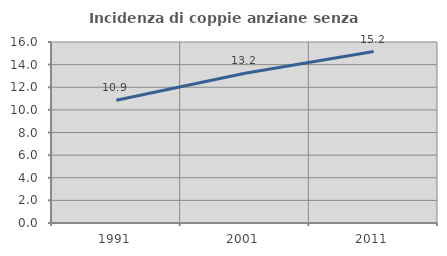
| Category | Incidenza di coppie anziane senza figli  |
|---|---|
| 1991.0 | 10.858 |
| 2001.0 | 13.236 |
| 2011.0 | 15.155 |